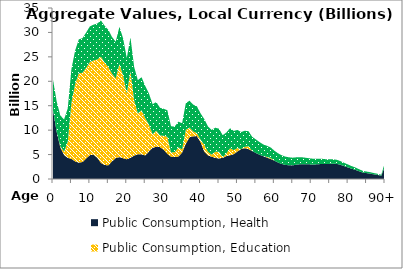
| Category | Public Consumption, Health | Public Consumption, Education | Public Consumption, Other than health and education |
|---|---|---|---|
| 0 | 14071.226 | 0 | 6235.63 |
|  | 9602.357 | 0 | 6253.967 |
| 2 | 6455.039 | 200.272 | 6329.315 |
| 3 | 4914.915 | 699.096 | 6579.432 |
| 4 | 4327.031 | 3299.913 | 6814.775 |
| 5 | 4121.938 | 11519.741 | 6876.913 |
| 6 | 3599.039 | 15840.821 | 6873.872 |
| 7 | 3340.019 | 18300.778 | 6945.222 |
| 8 | 3482.424 | 18263.15 | 7094.701 |
| 9 | 4211.957 | 18562.196 | 7220.976 |
| 10 | 4882.437 | 19073.894 | 7279.725 |
| 11 | 4967.957 | 19305.853 | 7317.703 |
| 12 | 4339.893 | 20126.361 | 7357.507 |
| 13 | 3290.008 | 21733.693 | 7413.301 |
| 14 | 2855.14 | 20978.522 | 7539.228 |
| 15 | 2813.818 | 20086.423 | 7626.569 |
| 16 | 3602.337 | 17933.948 | 7546.528 |
| 17 | 4286.517 | 16309.474 | 7492.82 |
| 18 | 4486.966 | 19045.812 | 7619.964 |
| 19 | 4249.759 | 16942.977 | 7599.281 |
| 20 | 4044.602 | 13475.638 | 7242.355 |
| 21 | 4346.179 | 17698.974 | 6923.756 |
| 22 | 4784.742 | 11302.239 | 6842.412 |
| 23 | 5076.789 | 8330.491 | 6825.552 |
| 24 | 5056.071 | 9044.329 | 6744.729 |
| 25 | 4818.316 | 7644.399 | 6578.39 |
| 26 | 5613.729 | 5529.235 | 6389.976 |
| 27 | 6384.617 | 2783.792 | 6147.681 |
| 28 | 6591.827 | 3284.24 | 5873.404 |
| 29 | 6522.195 | 2383.676 | 5672.302 |
| 30 | 6000.492 | 2847.796 | 5535.946 |
| 31 | 5133.462 | 3486.769 | 5443.39 |
| 32 | 4561.073 | 875.465 | 5347.446 |
| 33 | 4484.622 | 1002.001 | 5266.362 |
| 34 | 4591.532 | 1868.039 | 5278.007 |
| 35 | 5409.096 | 655.283 | 5352.486 |
| 36 | 7213.576 | 2856.834 | 5435.395 |
| 37 | 8543.931 | 1991.983 | 5491.884 |
| 38 | 8746.855 | 978.866 | 5497.533 |
| 39 | 8779.933 | 637.898 | 5451.212 |
| 40 | 7559.469 | 501.586 | 5383.164 |
| 41 | 5616.711 | 1367.073 | 5295.128 |
| 42 | 4827.413 | 739.131 | 5190.666 |
| 43 | 4573.521 | 405.874 | 5065.868 |
| 44 | 4320.749 | 1265.064 | 4909.697 |
| 45 | 4201.335 | 1384.898 | 4710.421 |
| 46 | 4330.155 | 143.527 | 4490.982 |
| 47 | 4695.063 | 532.952 | 4297.093 |
| 48 | 4858.295 | 1423.799 | 4112.417 |
| 49 | 5091.813 | 819.527 | 3926.002 |
| 50 | 5637.913 | 692.449 | 3718.817 |
| 51 | 6117.678 | 0 | 3494.946 |
| 52 | 6317.258 | 267.124 | 3288.369 |
| 53 | 6116.833 | 596.491 | 3074.145 |
| 54 | 5717.568 | 0 | 2920.059 |
| 55 | 5310.318 | 0 | 2788.309 |
| 56 | 4970.186 | 0 | 2590.51 |
| 57 | 4660.827 | 0 | 2414.35 |
| 58 | 4385.353 | 142.638 | 2274.257 |
| 59 | 4089.126 | 215.256 | 2154.934 |
| 60 | 3761.618 | 0 | 2037.089 |
| 61 | 3362.525 | 0 | 1901.602 |
| 62 | 3083.589 | 0 | 1782.192 |
| 63 | 2878.616 | 0 | 1701.369 |
| 64 | 2805.589 | 0 | 1631.409 |
| 65 | 2797.426 | 0 | 1568.402 |
| 66 | 2924.45 | 0 | 1513.651 |
| 67 | 3028.28 | 0 | 1444.126 |
| 68 | 3039.237 | 0 | 1365.475 |
| 69 | 3011.434 | 0 | 1283.262 |
| 70 | 2982.275 | 0 | 1203.568 |
| 71 | 2980.831 | 0 | 1143.951 |
| 72 | 3036.309 | 0 | 1105.364 |
| 73 | 3072.008 | 0 | 1060.173 |
| 74 | 3045.788 | 0 | 997.165 |
| 75 | 3095.398 | 0 | 951.453 |
| 76 | 3129.753 | 0 | 902.003 |
| 77 | 3081.055 | 0 | 831.869 |
| 78 | 2886.179 | 0 | 755.739 |
| 79 | 2615.307 | 0 | 671.353 |
| 80 | 2351.412 | 0 | 607.303 |
| 81 | 2089.381 | 0 | 544.904 |
| 82 | 1861.62 | 0 | 486.242 |
| 83 | 1579.581 | 0 | 414.805 |
| 84 | 1311.869 | 0 | 346.757 |
| 85 | 1205.752 | 0 | 320.424 |
| 86 | 1097.695 | 0 | 295.743 |
| 87 | 956.388 | 0 | 262.023 |
| 88 | 827.731 | 0 | 229.955 |
| 89 | 678.485 | 0 | 191.629 |
| 90+ | 2640.862 | 0 | 776.336 |